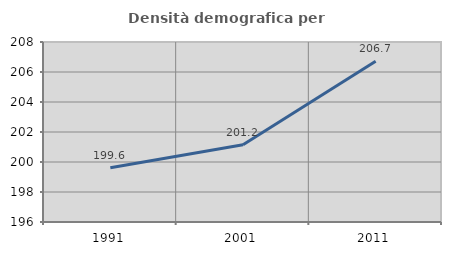
| Category | Densità demografica |
|---|---|
| 1991.0 | 199.619 |
| 2001.0 | 201.152 |
| 2011.0 | 206.71 |